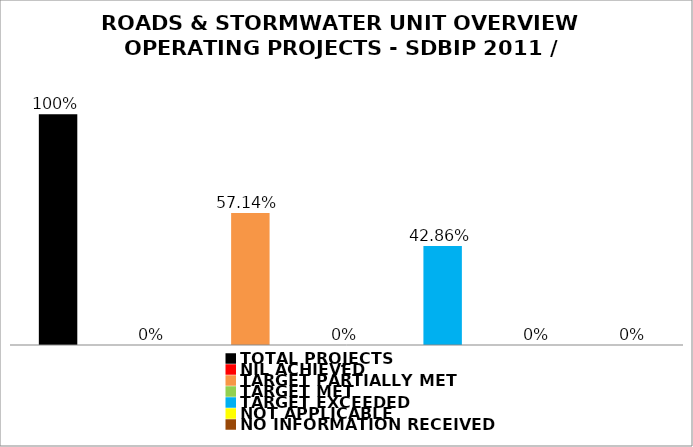
| Category | Series 0 |
|---|---|
| TOTAL PROJECTS | 1 |
| NIL ACHIEVED | 0 |
| TARGET PARTIALLY MET | 0.571 |
| TARGET MET | 0 |
| TARGET EXCEEDED | 0.429 |
| NOT APPLICABLE | 0 |
| NO INFORMATION RECEIVED | 0 |